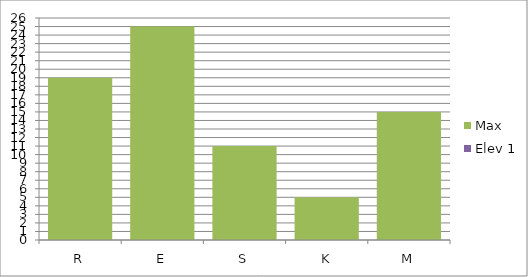
| Category | Max | Elev 1 |
|---|---|---|
| R | 19 | 0 |
| E | 25 | 0 |
| S | 11 | 0 |
| K | 5 | 0 |
| M | 15 | 0 |